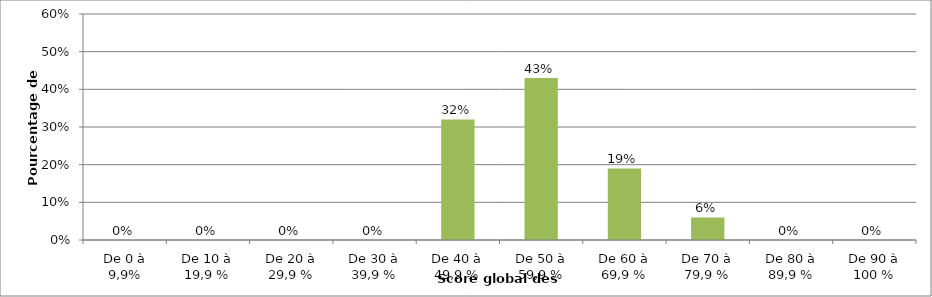
| Category | Series 0 |
|---|---|
| De 0 à 9,9% | 0 |
| De 10 à 19,9 % | 0 |
| De 20 à 29,9 % | 0 |
| De 30 à 39,9 % | 0 |
| De 40 à 49,9 % | 0.32 |
| De 50 à 59,9 % | 0.43 |
| De 60 à 69,9 % | 0.19 |
| De 70 à 79,9 % | 0.06 |
| De 80 à 89,9 % | 0 |
| De 90 à 100 % | 0 |